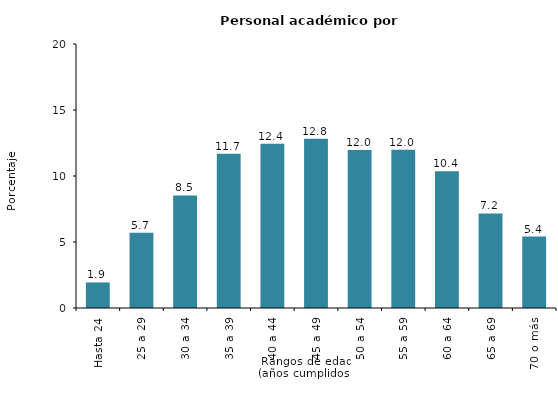
| Category | Series 0 |
|---|---|
| Hasta 24 | 1.936 |
| 25 a 29 | 5.695 |
| 30 a 34 | 8.526 |
| 35 a 39 | 11.688 |
| 40 a 44 | 12.438 |
| 45 a 49 | 12.816 |
| 50 a 54 | 11.976 |
| 55 a 59 | 11.981 |
| 60 a 64 | 10.362 |
| 65 a 69 | 7.166 |
| 70 o más | 5.415 |